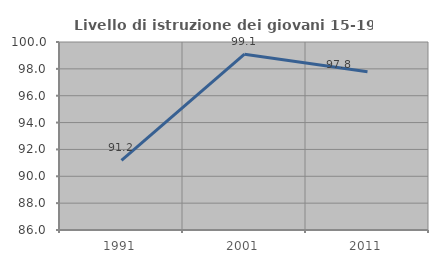
| Category | Livello di istruzione dei giovani 15-19 anni |
|---|---|
| 1991.0 | 91.189 |
| 2001.0 | 99.095 |
| 2011.0 | 97.778 |